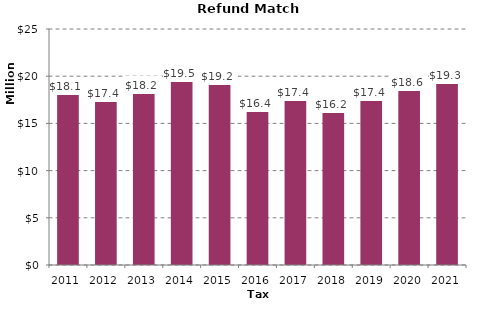
| Category | Total |
|---|---|
| 2011.0 | 18104923.31 |
| 2012.0 | 17368776.62 |
| 2013.0 | 18211926.47 |
| 2014.0 | 19469019.92 |
| 2015.0 | 19206043.66 |
| 2016.0 | 16359793.29 |
| 2017.0 | 17431562.34 |
| 2018.0 | 16204019.57 |
| 2019.0 | 17428289.38 |
| 2020.0 | 18570711.95 |
| 2021.0 | 19281706.66 |